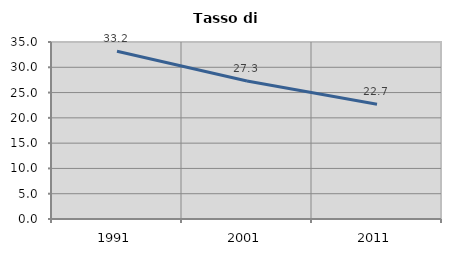
| Category | Tasso di disoccupazione   |
|---|---|
| 1991.0 | 33.169 |
| 2001.0 | 27.273 |
| 2011.0 | 22.675 |